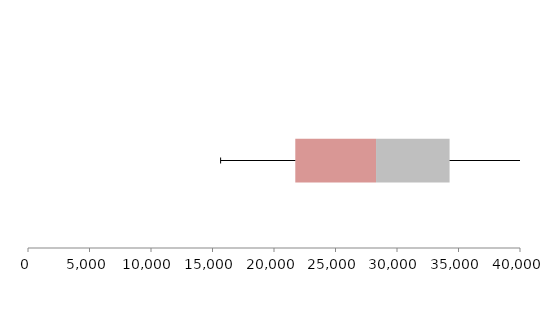
| Category | Series 1 | Series 2 | Series 3 |
|---|---|---|---|
| 0 | 21731.391 | 6564.687 | 5978.099 |